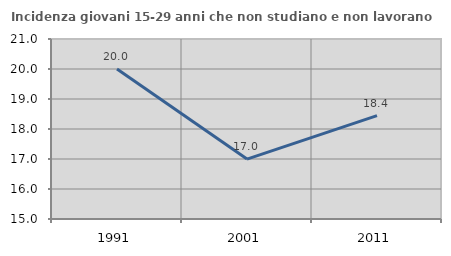
| Category | Incidenza giovani 15-29 anni che non studiano e non lavorano  |
|---|---|
| 1991.0 | 20 |
| 2001.0 | 16.998 |
| 2011.0 | 18.446 |